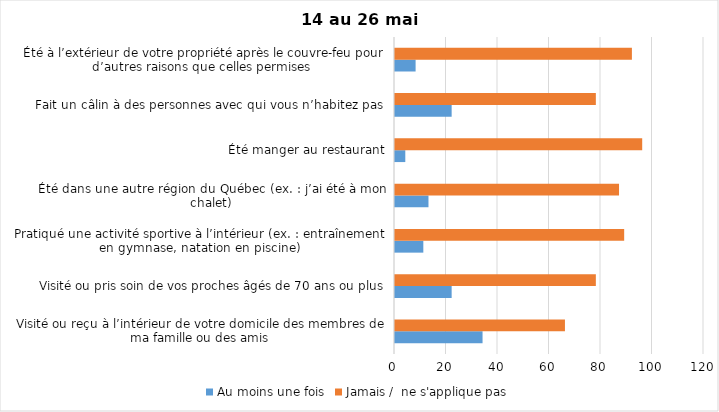
| Category | Au moins une fois | Jamais /  ne s'applique pas |
|---|---|---|
| Visité ou reçu à l’intérieur de votre domicile des membres de ma famille ou des amis | 34 | 66 |
| Visité ou pris soin de vos proches âgés de 70 ans ou plus | 22 | 78 |
| Pratiqué une activité sportive à l’intérieur (ex. : entraînement en gymnase, natation en piscine) | 11 | 89 |
| Été dans une autre région du Québec (ex. : j’ai été à mon chalet) | 13 | 87 |
| Été manger au restaurant | 4 | 96 |
| Fait un câlin à des personnes avec qui vous n’habitez pas | 22 | 78 |
| Été à l’extérieur de votre propriété après le couvre-feu pour d’autres raisons que celles permises  | 8 | 92 |